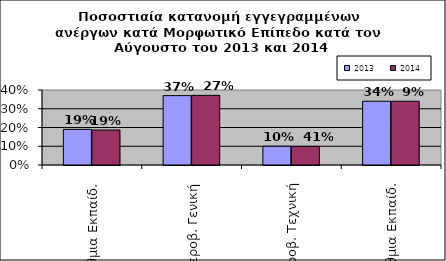
| Category | 2013 | 2014 |
|---|---|---|
| Πρωτοβάθμια Εκπαίδ. | 0.19 | 0.187 |
| Δευτεροβ. Γενική | 0.37 | 0.371 |
| Δευτεροβ. Τεχνική | 0.1 | 0.099 |
| Τριτοβάθμια Εκπαίδ. | 0.34 | 0.34 |